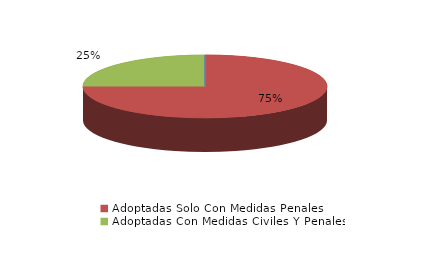
| Category | Series 0 |
|---|---|
| Denegadas | 0 |
| Adoptadas Solo Con Medidas Penales | 3 |
| Adoptadas Con Medidas Civiles Y Penales | 1 |
| Adoptadas Con Medidas Solo Civiles | 0 |